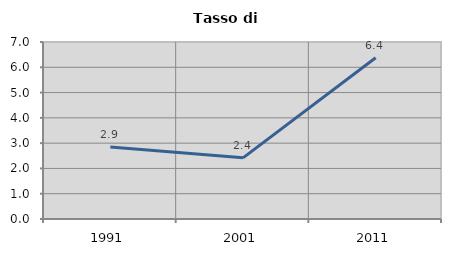
| Category | Tasso di disoccupazione   |
|---|---|
| 1991.0 | 2.85 |
| 2001.0 | 2.419 |
| 2011.0 | 6.38 |